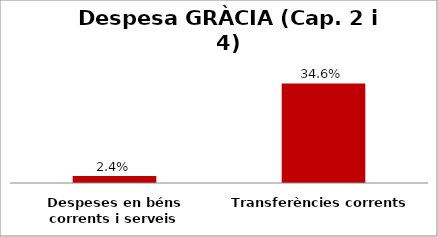
| Category | Series 0 |
|---|---|
| Despeses en béns corrents i serveis | 0.024 |
| Transferències corrents | 0.346 |